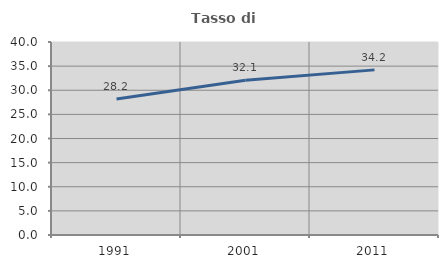
| Category | Tasso di occupazione   |
|---|---|
| 1991.0 | 28.195 |
| 2001.0 | 32.081 |
| 2011.0 | 34.224 |